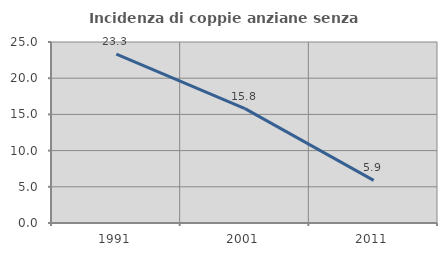
| Category | Incidenza di coppie anziane senza figli  |
|---|---|
| 1991.0 | 23.333 |
| 2001.0 | 15.789 |
| 2011.0 | 5.882 |